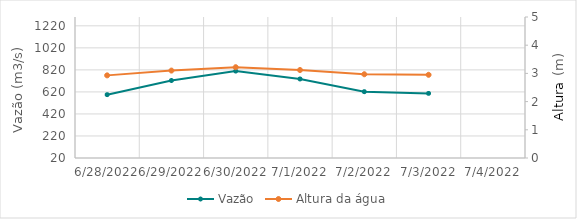
| Category | Vazão |
|---|---|
| 4/24/22 | 1210 |
| 4/23/22 | 1201.3 |
| 4/22/22 | 1092.04 |
| 4/21/22 | 872.7 |
| 4/20/22 | 826.65 |
| 4/19/22 | 848.22 |
| 4/18/22 | 835.75 |